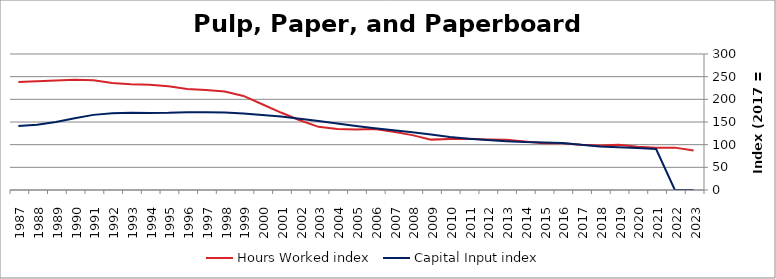
| Category | Hours Worked index | Capital Input index |
|---|---|---|
| 2023.0 | 87.189 | 0 |
| 2022.0 | 93.456 | 0 |
| 2021.0 | 93.039 | 90.487 |
| 2020.0 | 95.197 | 92.838 |
| 2019.0 | 99.629 | 94.165 |
| 2018.0 | 98.08 | 96.204 |
| 2017.0 | 100 | 100 |
| 2016.0 | 103.026 | 103.476 |
| 2015.0 | 103.027 | 105.026 |
| 2014.0 | 106.973 | 105.933 |
| 2013.0 | 110.918 | 107.781 |
| 2012.0 | 111.669 | 110.426 |
| 2011.0 | 113.16 | 113.102 |
| 2010.0 | 112.255 | 117.065 |
| 2009.0 | 111.123 | 122.564 |
| 2008.0 | 121.092 | 127.333 |
| 2007.0 | 128.293 | 131.665 |
| 2006.0 | 134.674 | 136.141 |
| 2005.0 | 133.63 | 140.962 |
| 2004.0 | 134.675 | 146.437 |
| 2003.0 | 139.289 | 152.134 |
| 2002.0 | 153.989 | 157.383 |
| 2001.0 | 170.869 | 162.126 |
| 2000.0 | 189.236 | 165.318 |
| 1999.0 | 207.479 | 169.016 |
| 1998.0 | 217.255 | 171.175 |
| 1997.0 | 220.793 | 171.564 |
| 1996.0 | 223.046 | 171.433 |
| 1995.0 | 228.726 | 170.137 |
| 1994.0 | 231.98 | 170.104 |
| 1993.0 | 233.241 | 170.613 |
| 1992.0 | 235.966 | 169.554 |
| 1991.0 | 241.927 | 165.732 |
| 1990.0 | 242.968 | 158.199 |
| 1989.0 | 241.406 | 149.816 |
| 1988.0 | 240.116 | 144.136 |
| 1987.0 | 238.145 | 141.345 |